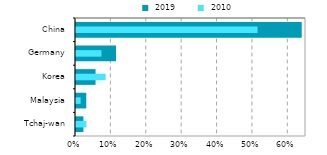
| Category |  2019 |
|---|---|
| Tchaj-wan | 0.021 |
| Malaysia | 0.029 |
| Korea | 0.055 |
| Germany | 0.113 |
| China | 0.638 |